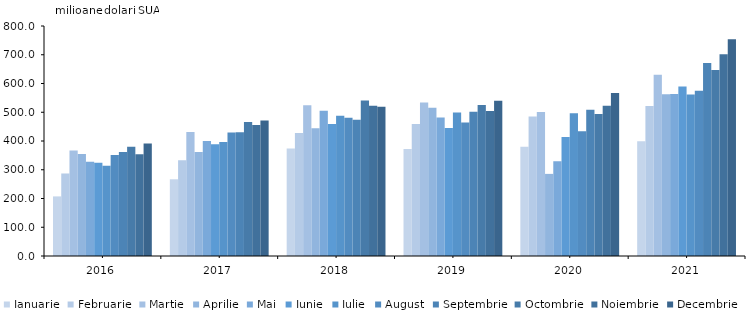
| Category | Ianuarie | Februarie | Martie | Aprilie | Mai | Iunie | Iulie | August | Septembrie | Octombrie | Noiembrie | Decembrie |
|---|---|---|---|---|---|---|---|---|---|---|---|---|
| 2016.0 | 207.3 | 287 | 366.8 | 354.9 | 327.7 | 324.6 | 314.1 | 351.1 | 361.6 | 380.2 | 353.5 | 391.4 |
| 2017.0 | 266.8 | 332.7 | 431.2 | 361.5 | 400.4 | 388.8 | 396.9 | 429.7 | 430.8 | 465.9 | 455.3 | 471.4 |
| 2018.0 | 374.3 | 427.6 | 524.1 | 444.6 | 505.6 | 458.7 | 488 | 480.7 | 474 | 540.6 | 522.6 | 519.3 |
| 2019.0 | 372.6 | 459.3 | 533.8 | 515.6 | 481.6 | 445.4 | 499.1 | 464.3 | 501.7 | 525.3 | 504.1 | 539.7 |
| 2020.0 | 379.8 | 484.8 | 500.5 | 285.6 | 329.4 | 413.5 | 496.6 | 433.6 | 508.3 | 493.6 | 522.9 | 567.3 |
| 2021.0 | 399.4 | 521.4 | 630.1 | 562.2 | 563.4 | 589.7 | 562 | 574.9 | 671.2 | 646.9 | 701.5 | 754 |